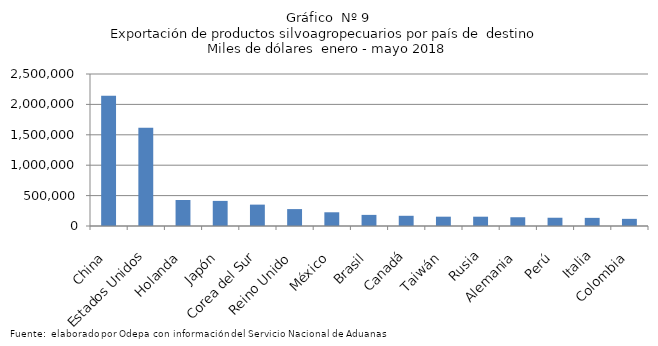
| Category | Series 0 |
|---|---|
| China | 2143988.054 |
| Estados Unidos | 1617485.436 |
| Holanda | 427978.576 |
| Japón | 412918.608 |
| Corea del Sur | 351605.456 |
| Reino Unido | 278177.416 |
| México | 225621.801 |
| Brasil | 182769.008 |
| Canadá | 167892.841 |
| Taiwán | 153206.937 |
| Rusia | 152944.745 |
| Alemania | 143988.078 |
| Perú | 135856.421 |
| Italia | 133885.731 |
| Colombia | 117526.086 |